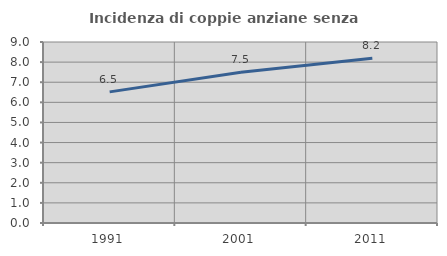
| Category | Incidenza di coppie anziane senza figli  |
|---|---|
| 1991.0 | 6.521 |
| 2001.0 | 7.491 |
| 2011.0 | 8.194 |